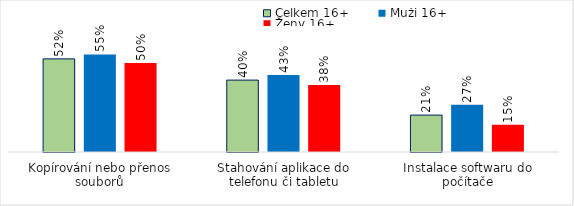
| Category | Celkem 16+ | Muži 16+ | Ženy 16+ |
|---|---|---|---|
| Kopírování nebo přenos souborů | 0.522 | 0.547 | 0.499 |
| Stahování aplikace do telefonu či tabletu | 0.403 | 0.432 | 0.376 |
| Instalace softwaru do počítače | 0.207 | 0.265 | 0.153 |